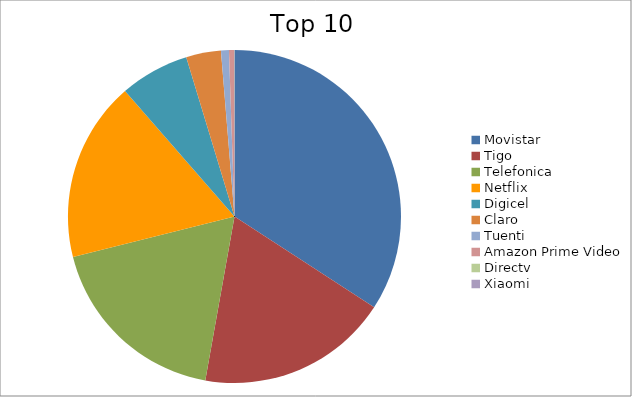
| Category | Series 0 |
|---|---|
| Movistar | 34.17 |
| Tigo | 18.64 |
| Telefonica | 18.29 |
| Netflix | 17.48 |
| Digicel | 6.74 |
| Claro | 3.38 |
| Tuenti | 0.77 |
| Amazon Prime Video | 0.5 |
| Directv | 0.02 |
| Xiaomi | 0.01 |